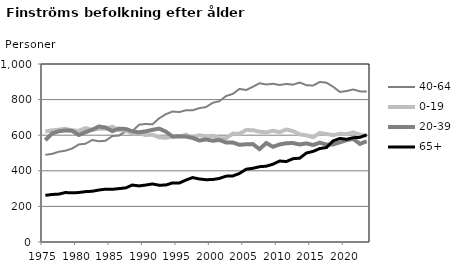
| Category | 40-64 | 0-19 | 20-39 | 65+ |
|---|---|---|---|---|
| 1975.0 | 490 | 621 | 572 | 262 |
| 1976.0 | 495 | 627 | 610 | 267 |
| 1977.0 | 507 | 631 | 622 | 269 |
| 1978.0 | 513 | 636 | 627 | 278 |
| 1979.0 | 525 | 627 | 625 | 276 |
| 1980.0 | 548 | 625 | 601 | 278 |
| 1981.0 | 552 | 640 | 617 | 283 |
| 1982.0 | 573 | 630 | 631 | 285 |
| 1983.0 | 566 | 637 | 649 | 292 |
| 1984.0 | 569 | 636 | 643 | 297 |
| 1985.0 | 595 | 648 | 623 | 296 |
| 1986.0 | 598 | 628 | 637 | 300 |
| 1987.0 | 621 | 628 | 635 | 304 |
| 1988.0 | 623 | 609 | 622 | 320 |
| 1989.0 | 659 | 611 | 616 | 315 |
| 1990.0 | 663 | 601 | 622 | 320 |
| 1991.0 | 661 | 603 | 630 | 326 |
| 1992.0 | 695 | 588 | 637 | 319 |
| 1993.0 | 718 | 585 | 620 | 320 |
| 1994.0 | 733 | 592 | 593 | 332 |
| 1995.0 | 730 | 591 | 594 | 331 |
| 1996.0 | 740 | 603 | 592 | 348 |
| 1997.0 | 740 | 586 | 585 | 362 |
| 1998.0 | 752 | 600 | 570 | 354 |
| 1999.0 | 758 | 593 | 576 | 350 |
| 2000.0 | 782 | 597 | 569 | 351 |
| 2001.0 | 791 | 583 | 573 | 357 |
| 2002.0 | 820 | 583 | 559 | 370 |
| 2003.0 | 832 | 609 | 559 | 371 |
| 2004.0 | 860 | 608 | 546 | 385 |
| 2005.0 | 854 | 629 | 549 | 409 |
| 2006.0 | 872 | 628 | 550 | 414 |
| 2007.0 | 892 | 620 | 522 | 423 |
| 2008.0 | 885 | 616 | 556 | 426 |
| 2009.0 | 889 | 625 | 535 | 437 |
| 2010.0 | 882 | 617 | 548 | 455 |
| 2011.0 | 888 | 632 | 555 | 452 |
| 2012.0 | 884 | 623 | 556 | 468 |
| 2013.0 | 896 | 605 | 548 | 471 |
| 2014.0 | 881 | 599 | 554 | 500 |
| 2015.0 | 879 | 589 | 545 | 509 |
| 2016.0 | 899 | 612 | 558 | 525 |
| 2017.0 | 895 | 607 | 547 | 531 |
| 2018.0 | 872 | 600 | 548 | 568 |
| 2019.0 | 843 | 608 | 560 | 582 |
| 2020.0 | 848 | 606 | 572 | 577 |
| 2021.0 | 857 | 616 | 579 | 586 |
| 2022.0 | 846 | 603 | 551 | 588 |
| 2023.0 | 846 | 596 | 566 | 602 |